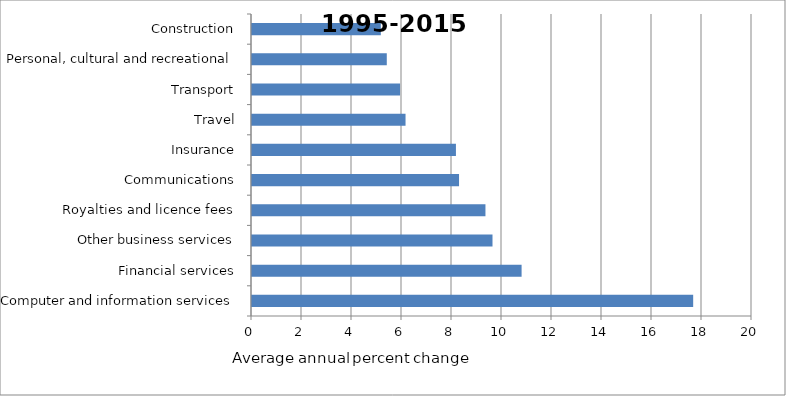
| Category | 1995-2015  |
|---|---|
| Computer and information services | 17.647 |
| Financial services | 10.784 |
| Other business services | 9.62 |
| Royalties and licence fees | 9.338 |
| Communications | 8.282 |
| Insurance | 8.157 |
| Travel | 6.142 |
| Transport | 5.923 |
| Personal, cultural and recreational | 5.392 |
| Construction | 5.153 |